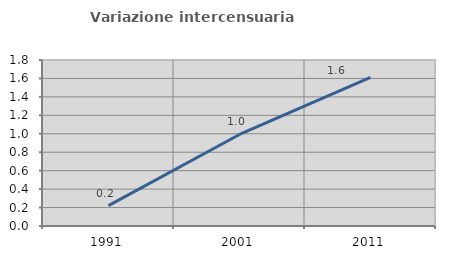
| Category | Variazione intercensuaria annua |
|---|---|
| 1991.0 | 0.221 |
| 2001.0 | 0.993 |
| 2011.0 | 1.611 |